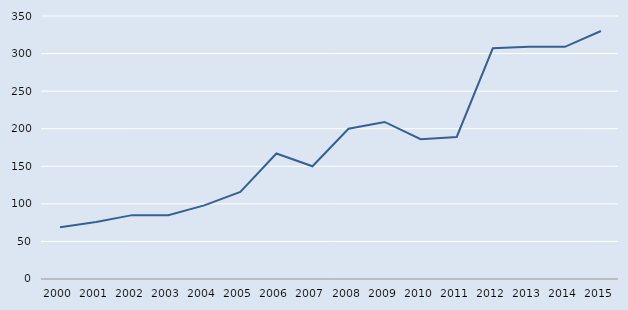
| Category | Series 0 |
|---|---|
| 2000.0 | 69 |
| 2001.0 | 76 |
| 2002.0 | 85 |
| 2003.0 | 85 |
| 2004.0 | 98 |
| 2005.0 | 116 |
| 2006.0 | 167 |
| 2007.0 | 150 |
| 2008.0 | 200 |
| 2009.0 | 209 |
| 2010.0 | 186 |
| 2011.0 | 189 |
| 2012.0 | 307 |
| 2013.0 | 309 |
| 2014.0 | 309 |
| 2015.0 | 330 |